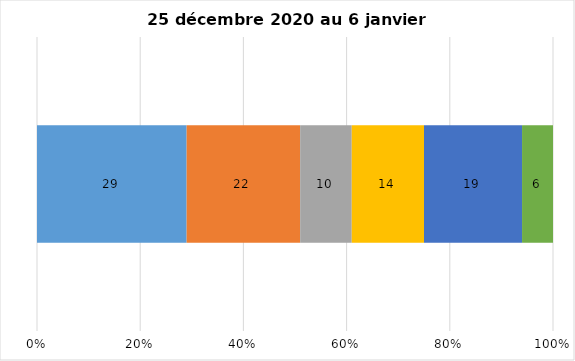
| Category | Plusieurs fois par jour | Une fois par jour | Quelques fois par semaine   | Une fois par semaine ou moins   |  Jamais   |  Je n’utilise pas les médias sociaux |
|---|---|---|---|---|---|---|
| 0 | 29 | 22 | 10 | 14 | 19 | 6 |